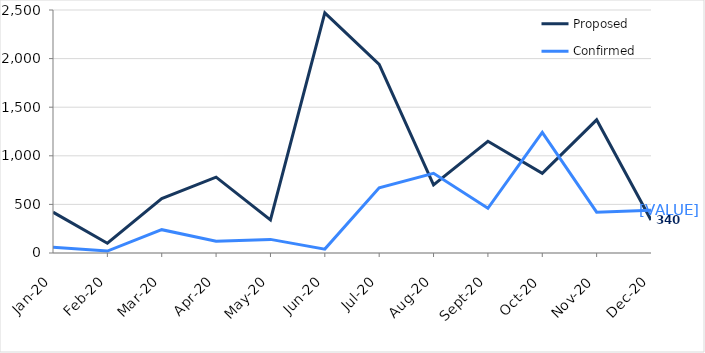
| Category | Proposed | Confirmed |
|---|---|---|
| 2020-01-01 | 420 | 60 |
| 2020-02-01 | 100 | 20 |
| 2020-03-01 | 560 | 240 |
| 2020-04-01 | 780 | 120 |
| 2020-05-01 | 340 | 140 |
| 2020-06-01 | 2470 | 40 |
| 2020-07-01 | 1940 | 670 |
| 2020-08-01 | 700 | 820 |
| 2020-09-01 | 1150 | 460 |
| 2020-10-01 | 820 | 1240 |
| 2020-11-01 | 1370 | 420 |
| 2020-12-01 | 340 | 440 |